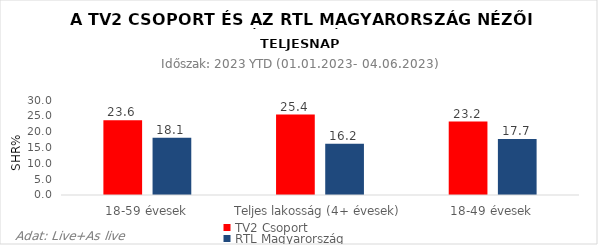
| Category | TV2 Csoport | RTL Magyarország |
|---|---|---|
| 18-59 évesek | 23.6 | 18.1 |
| Teljes lakosság (4+ évesek) | 25.4 | 16.2 |
| 18-49 évesek | 23.2 | 17.7 |